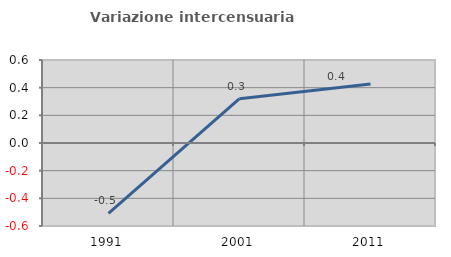
| Category | Variazione intercensuaria annua |
|---|---|
| 1991.0 | -0.508 |
| 2001.0 | 0.32 |
| 2011.0 | 0.427 |